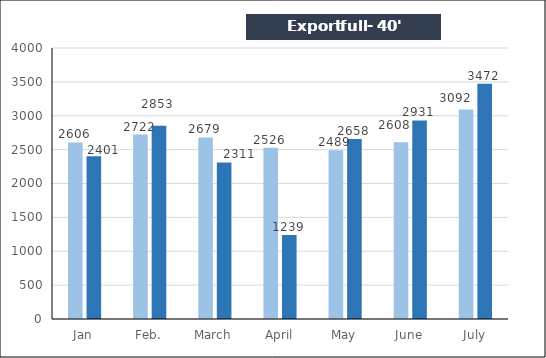
| Category | Export full - 40' |
|---|---|
| Jan | 2401 |
| Feb. | 2853 |
| March | 2311 |
| April | 1239 |
| May | 2658 |
| June | 2931 |
| July | 3472 |